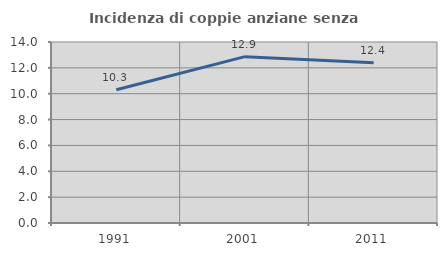
| Category | Incidenza di coppie anziane senza figli  |
|---|---|
| 1991.0 | 10.304 |
| 2001.0 | 12.865 |
| 2011.0 | 12.395 |